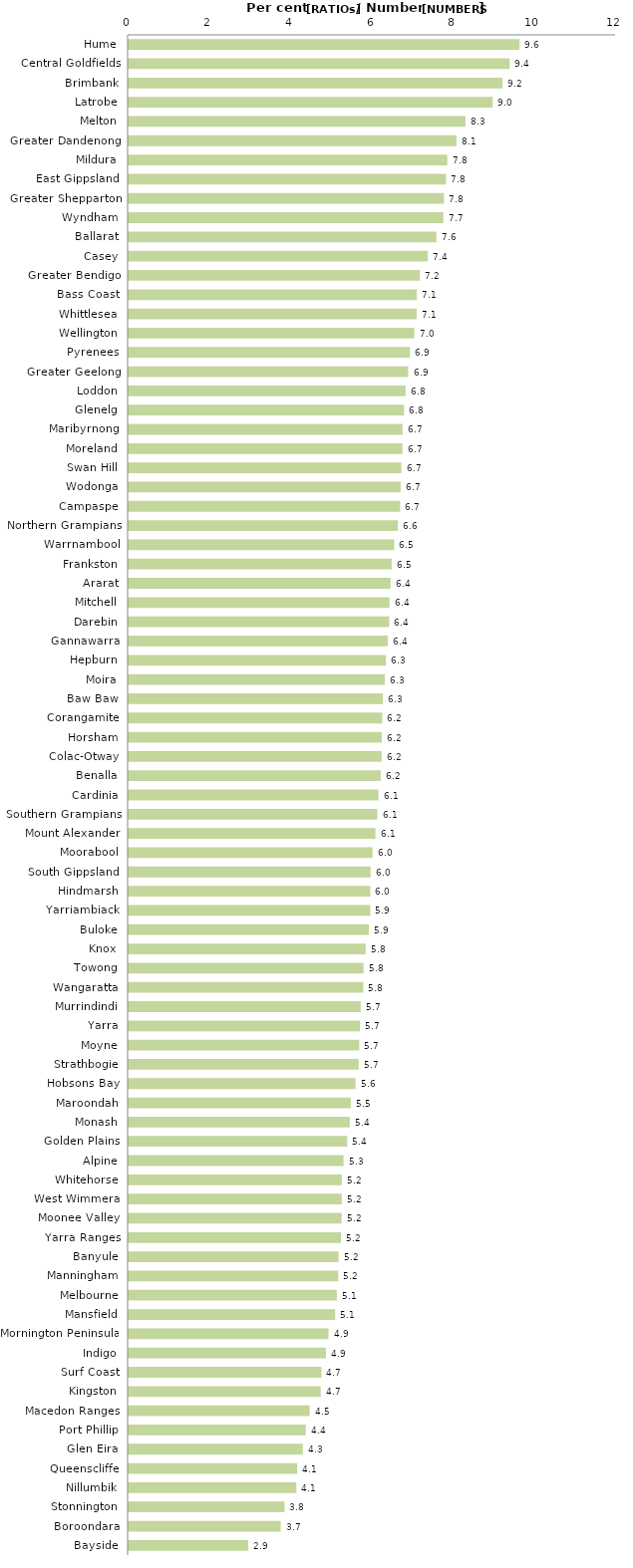
| Category | Series 0 |
|---|---|
| Hume | 9.623 |
| Central Goldfields | 9.382 |
| Brimbank | 9.206 |
| Latrobe | 8.963 |
| Melton | 8.292 |
| Greater Dandenong | 8.07 |
| Mildura | 7.846 |
| East Gippsland | 7.813 |
| Greater Shepparton | 7.764 |
| Wyndham | 7.748 |
| Ballarat | 7.577 |
| Casey | 7.364 |
| Greater Bendigo | 7.17 |
| Bass Coast | 7.095 |
| Whittlesea | 7.093 |
| Wellington | 7.031 |
| Pyrenees | 6.927 |
| Greater Geelong | 6.884 |
| Loddon | 6.817 |
| Glenelg | 6.782 |
| Maribyrnong | 6.745 |
| Moreland | 6.741 |
| Swan Hill | 6.716 |
| Wodonga | 6.698 |
| Campaspe | 6.685 |
| Northern Grampians | 6.631 |
| Warrnambool | 6.539 |
| Frankston | 6.477 |
| Ararat | 6.448 |
| Mitchell | 6.421 |
| Darebin | 6.415 |
| Gannawarra | 6.379 |
| Hepburn | 6.335 |
| Moira | 6.308 |
| Baw Baw | 6.261 |
| Corangamite | 6.244 |
| Horsham | 6.232 |
| Colac-Otway | 6.229 |
| Benalla | 6.206 |
| Cardinia | 6.15 |
| Southern Grampians | 6.123 |
| Mount Alexander | 6.077 |
| Moorabool | 6.005 |
| South Gippsland | 5.958 |
| Hindmarsh | 5.95 |
| Yarriambiack | 5.949 |
| Buloke | 5.913 |
| Knox | 5.835 |
| Towong | 5.785 |
| Wangaratta | 5.778 |
| Murrindindi | 5.715 |
| Yarra | 5.695 |
| Moyne | 5.678 |
| Strathbogie | 5.665 |
| Hobsons Bay | 5.587 |
| Maroondah | 5.47 |
| Monash | 5.443 |
| Golden Plains | 5.382 |
| Alpine | 5.291 |
| Whitehorse | 5.249 |
| West Wimmera | 5.247 |
| Moonee Valley | 5.244 |
| Yarra Ranges | 5.227 |
| Banyule | 5.168 |
| Manningham | 5.16 |
| Melbourne | 5.125 |
| Mansfield | 5.086 |
| Mornington Peninsula | 4.921 |
| Indigo | 4.857 |
| Surf Coast | 4.746 |
| Kingston | 4.729 |
| Macedon Ranges | 4.457 |
| Port Phillip | 4.364 |
| Glen Eira | 4.289 |
| Queenscliffe | 4.149 |
| Nillumbik | 4.13 |
| Stonnington | 3.839 |
| Boroondara | 3.745 |
| Bayside | 2.946 |